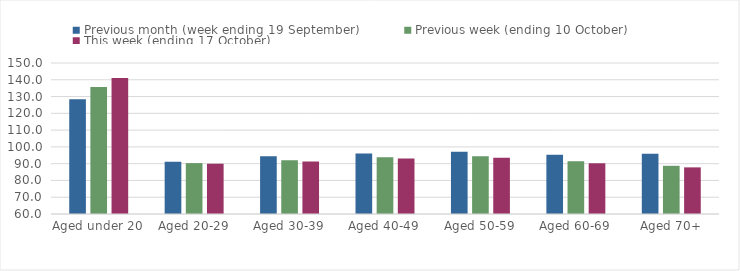
| Category | Previous month (week ending 19 September) | Previous week (ending 10 October) | This week (ending 17 October) |
|---|---|---|---|
| Aged under 20 | 128.33 | 135.7 | 141.02 |
| Aged 20-29 | 91.19 | 90.33 | 89.97 |
| Aged 30-39 | 94.35 | 92.07 | 91.36 |
| Aged 40-49 | 96.12 | 93.82 | 93.12 |
| Aged 50-59 | 97.04 | 94.38 | 93.48 |
| Aged 60-69 | 95.32 | 91.47 | 90.24 |
| Aged 70+ | 95.84 | 88.73 | 87.79 |